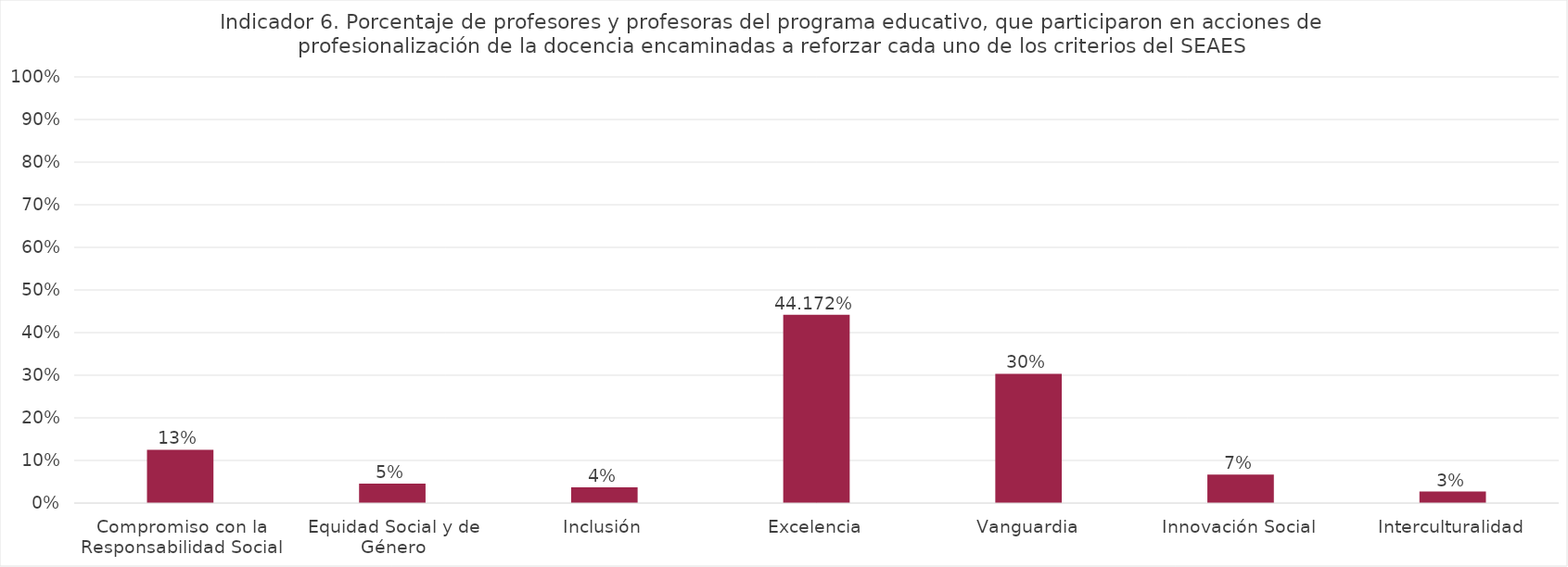
| Category | Docentes |
|---|---|
| Compromiso con la Responsabilidad Social | 0.125 |
| Equidad Social y de Género | 0.046 |
| Inclusión | 0.037 |
| Excelencia | 0.442 |
| Vanguardia | 0.303 |
| Innovación Social | 0.067 |
| Interculturalidad | 0.027 |